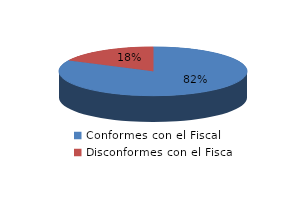
| Category | Series 0 |
|---|---|
| 0 | 211 |
| 1 | 45 |